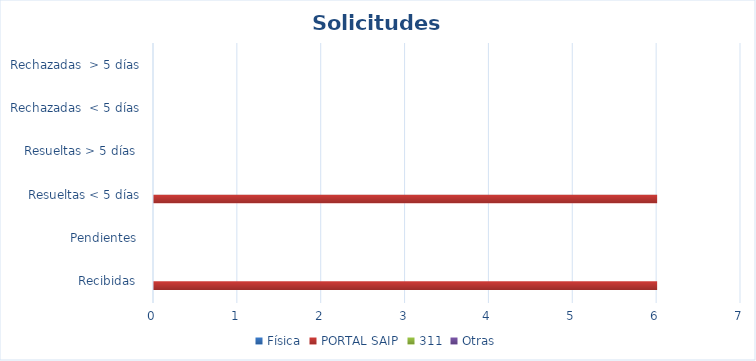
| Category | Física | PORTAL SAIP | 311 | Otras |
|---|---|---|---|---|
| Recibidas  | 0 | 6 | 0 | 0 |
| Pendientes  | 0 | 0 | 0 | 0 |
| Resueltas < 5 días | 0 | 6 | 0 | 0 |
| Resueltas > 5 días  | 0 | 0 | 0 | 0 |
| Rechazadas  < 5 días | 0 | 0 | 0 | 0 |
| Rechazadas  > 5 días | 0 | 0 | 0 | 0 |